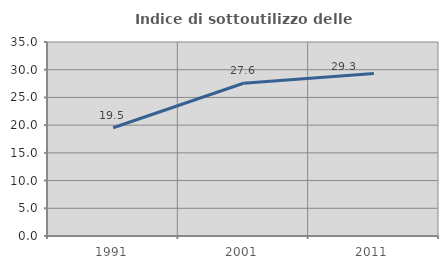
| Category | Indice di sottoutilizzo delle abitazioni  |
|---|---|
| 1991.0 | 19.531 |
| 2001.0 | 27.56 |
| 2011.0 | 29.334 |